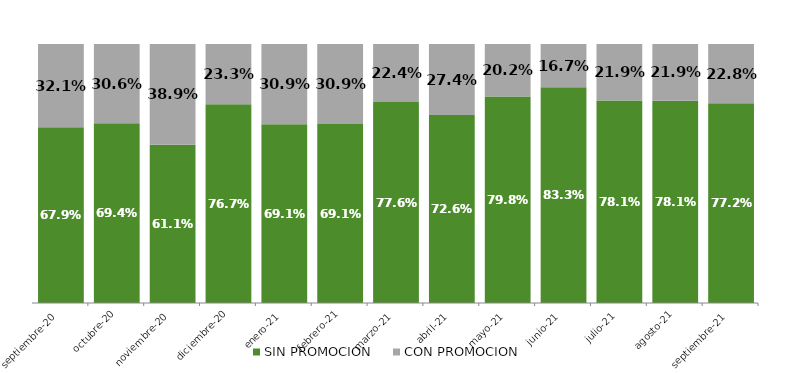
| Category | SIN PROMOCION   | CON PROMOCION   |
|---|---|---|
| 2020-09-01 | 0.679 | 0.321 |
| 2020-10-01 | 0.694 | 0.306 |
| 2020-11-01 | 0.611 | 0.389 |
| 2020-12-01 | 0.767 | 0.233 |
| 2021-01-01 | 0.691 | 0.309 |
| 2021-02-01 | 0.691 | 0.309 |
| 2021-03-01 | 0.776 | 0.224 |
| 2021-04-01 | 0.726 | 0.274 |
| 2021-05-01 | 0.798 | 0.202 |
| 2021-06-01 | 0.833 | 0.167 |
| 2021-07-01 | 0.781 | 0.219 |
| 2021-08-01 | 0.781 | 0.219 |
| 2021-09-01 | 0.772 | 0.228 |